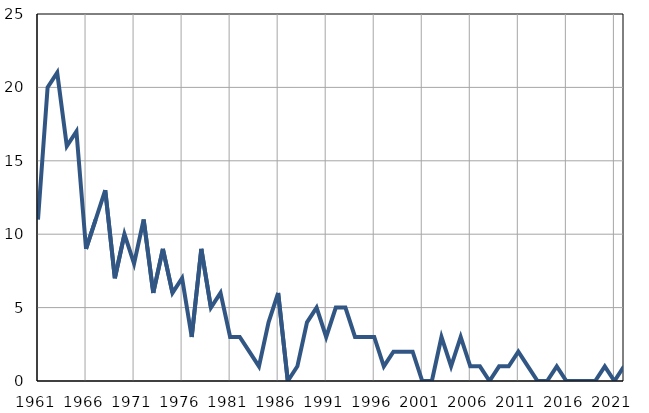
| Category | Infants
deaths |
|---|---|
| 1961.0 | 11 |
| 1962.0 | 20 |
| 1963.0 | 21 |
| 1964.0 | 16 |
| 1965.0 | 17 |
| 1966.0 | 9 |
| 1967.0 | 11 |
| 1968.0 | 13 |
| 1969.0 | 7 |
| 1970.0 | 10 |
| 1971.0 | 8 |
| 1972.0 | 11 |
| 1973.0 | 6 |
| 1974.0 | 9 |
| 1975.0 | 6 |
| 1976.0 | 7 |
| 1977.0 | 3 |
| 1978.0 | 9 |
| 1979.0 | 5 |
| 1980.0 | 6 |
| 1981.0 | 3 |
| 1982.0 | 3 |
| 1983.0 | 2 |
| 1984.0 | 1 |
| 1985.0 | 4 |
| 1986.0 | 6 |
| 1987.0 | 0 |
| 1988.0 | 1 |
| 1989.0 | 4 |
| 1990.0 | 5 |
| 1991.0 | 3 |
| 1992.0 | 5 |
| 1993.0 | 5 |
| 1994.0 | 3 |
| 1995.0 | 3 |
| 1996.0 | 3 |
| 1997.0 | 1 |
| 1998.0 | 2 |
| 1999.0 | 2 |
| 2000.0 | 2 |
| 2001.0 | 0 |
| 2002.0 | 0 |
| 2003.0 | 3 |
| 2004.0 | 1 |
| 2005.0 | 3 |
| 2006.0 | 1 |
| 2007.0 | 1 |
| 2008.0 | 0 |
| 2009.0 | 1 |
| 2010.0 | 1 |
| 2011.0 | 2 |
| 2012.0 | 1 |
| 2013.0 | 0 |
| 2014.0 | 0 |
| 2015.0 | 1 |
| 2016.0 | 0 |
| 2017.0 | 0 |
| 2018.0 | 0 |
| 2019.0 | 0 |
| 2020.0 | 1 |
| 2021.0 | 0 |
| 2022.0 | 1 |